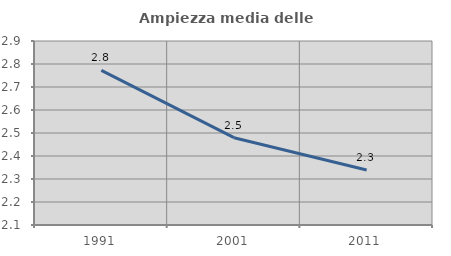
| Category | Ampiezza media delle famiglie |
|---|---|
| 1991.0 | 2.772 |
| 2001.0 | 2.48 |
| 2011.0 | 2.339 |